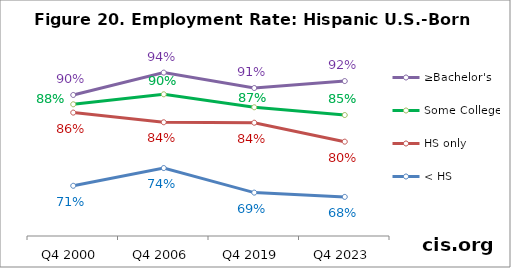
| Category | ≥Bachelor's | Some College | HS only | < HS |
|---|---|---|---|---|
| Q4 2000 | 0.895 | 0.876 | 0.858 | 0.705 |
| Q4 2006 | 0.942 | 0.897 | 0.838 | 0.742 |
| Q4 2019 | 0.91 | 0.87 | 0.837 | 0.691 |
| Q4 2023 | 0.924 | 0.853 | 0.798 | 0.682 |